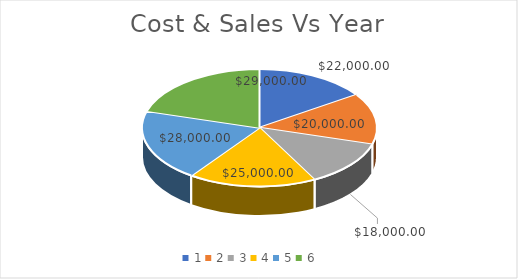
| Category | Series 0 |
|---|---|
| 0 | 22000 |
| 1 | 20000 |
| 2 | 18000 |
| 3 | 25000 |
| 4 | 28000 |
| 5 | 29000 |